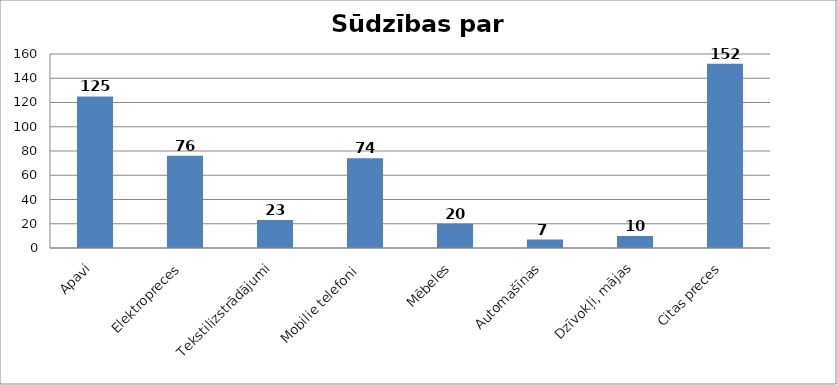
| Category | Series 0 |
|---|---|
| Apavi | 125 |
| Elektropreces | 76 |
| Tekstilizstrādājumi | 23 |
| Mobilie telefoni  | 74 |
| Mēbeles | 20 |
| Automašīnas | 7 |
| Dzīvokļi, mājas | 10 |
| Citas preces | 152 |